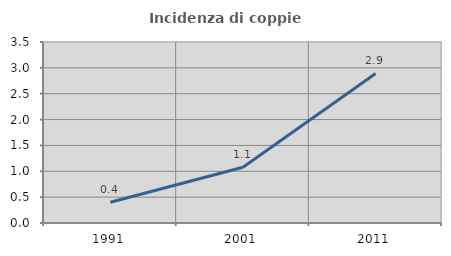
| Category | Incidenza di coppie miste |
|---|---|
| 1991.0 | 0.401 |
| 2001.0 | 1.078 |
| 2011.0 | 2.891 |